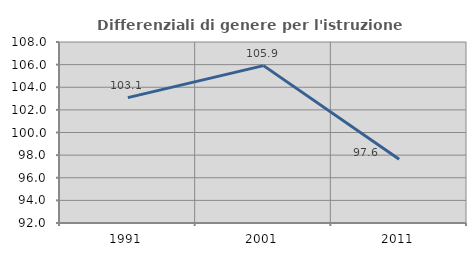
| Category | Differenziali di genere per l'istruzione superiore |
|---|---|
| 1991.0 | 103.082 |
| 2001.0 | 105.911 |
| 2011.0 | 97.628 |